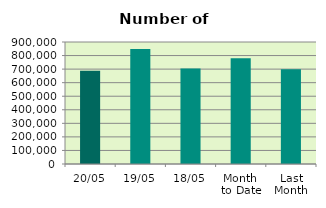
| Category | Series 0 |
|---|---|
| 20/05 | 687138 |
| 19/05 | 848464 |
| 18/05 | 705288 |
| Month 
to Date | 779485 |
| Last
Month | 699227 |